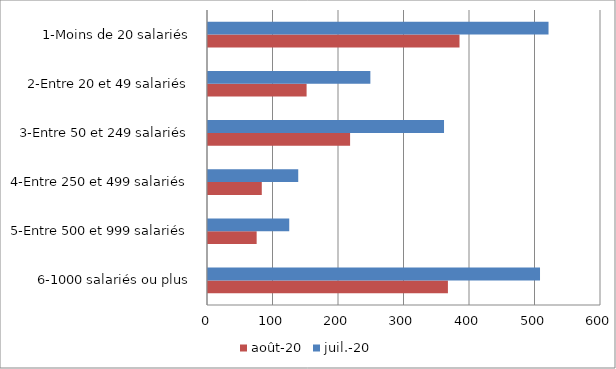
| Category | août-20 | juil.-20 |
|---|---|---|
| 6-1000 salariés ou plus | 366.289 | 506.894 |
| 5-Entre 500 et 999 salariés | 74.281 | 124.032 |
| 4-Entre 250 et 499 salariés | 82.12 | 137.766 |
| 3-Entre 50 et 249 salariés | 216.937 | 360.339 |
| 2-Entre 20 et 49 salariés | 150.531 | 247.887 |
| 1-Moins de 20 salariés | 383.993 | 519.883 |